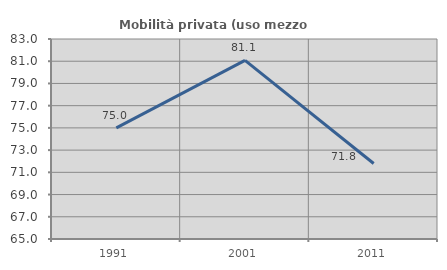
| Category | Mobilità privata (uso mezzo privato) |
|---|---|
| 1991.0 | 75 |
| 2001.0 | 81.081 |
| 2011.0 | 71.795 |